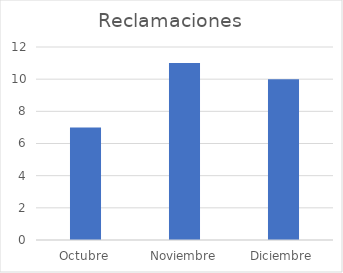
| Category | Reclamaciones |
|---|---|
| Octubre | 7 |
| Noviembre | 11 |
| Diciembre | 10 |